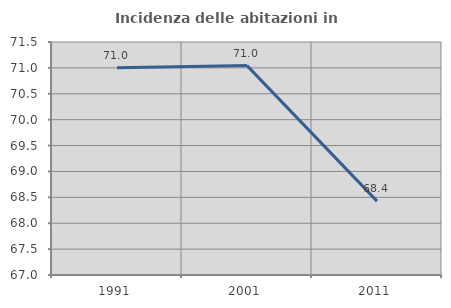
| Category | Incidenza delle abitazioni in proprietà  |
|---|---|
| 1991.0 | 71.003 |
| 2001.0 | 71.044 |
| 2011.0 | 68.427 |